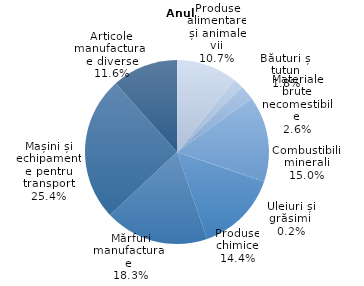
| Category | Series 0 |
|---|---|
| Produse alimentare și animale vii | 10.7 |
| Băuturi și tutun | 1.8 |
| Materiale brute necomestibile | 2.6 |
| Combustibili minerali | 15 |
| Uleiuri și grăsimi  | 0.2 |
| Produse chimice | 14.4 |
| Mărfuri manufacturate  | 18.3 |
| Mașini și echipamente pentru transport | 25.4 |
| Articole manufacturate diverse | 11.6 |